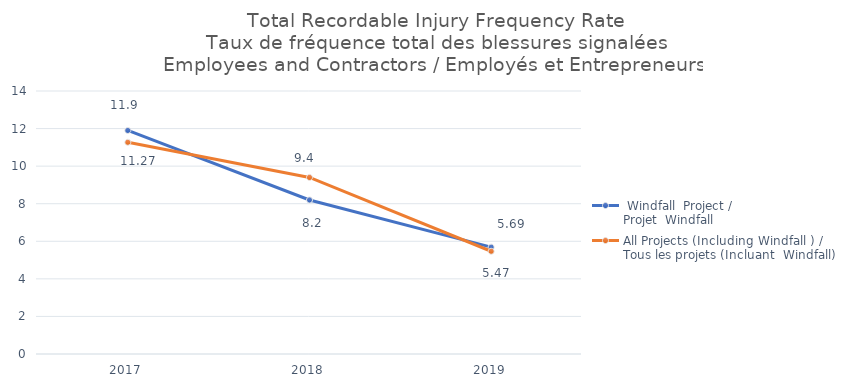
| Category |  Windfall  Project / 
Projet  Windfall | All Projects (Including Windfall ) / 
Tous les projets (Incluant  Windfall) |
|---|---|---|
| 2017 | 11.9 | 11.27 |
| 2018 | 8.2 | 9.4 |
| 2019 | 5.69 | 5.47 |